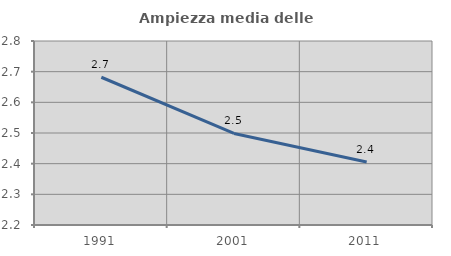
| Category | Ampiezza media delle famiglie |
|---|---|
| 1991.0 | 2.682 |
| 2001.0 | 2.498 |
| 2011.0 | 2.405 |